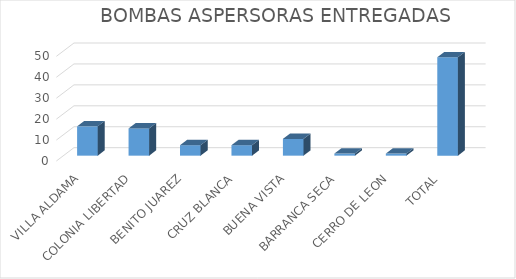
| Category | BOMBAS ASPERSORAS |
|---|---|
| VILLA ALDAMA | 14 |
| COLONIA LIBERTAD | 13 |
| BENITO JUAREZ | 5 |
| CRUZ BLANCA | 5 |
| BUENA VISTA | 8 |
| BARRANCA SECA | 1 |
| CERRO DE LEON | 1 |
| TOTAL | 47 |